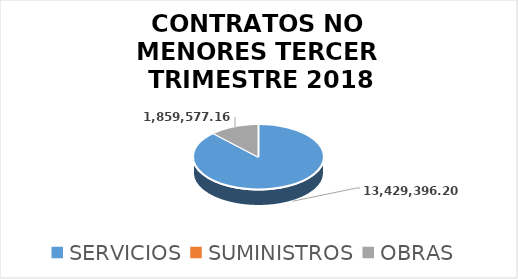
| Category | Series 0 |
|---|---|
| SERVICIOS | 13429396.2 |
| SUMINISTROS | 0 |
| OBRAS | 1859577.16 |